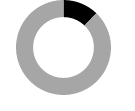
| Category | Series 0 |
|---|---|
| 0 | 0.122 |
| 1 | 0.878 |